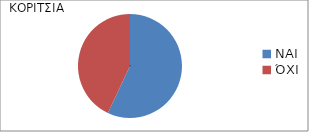
| Category | Series 0 |
|---|---|
| ΝΑΙ | 0.57 |
| ΌΧΙ | 0.43 |